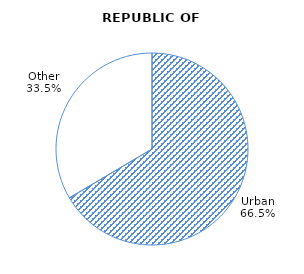
| Category | Series 0 |
|---|---|
| Urban | 66.5 |
| Other | 33.5 |